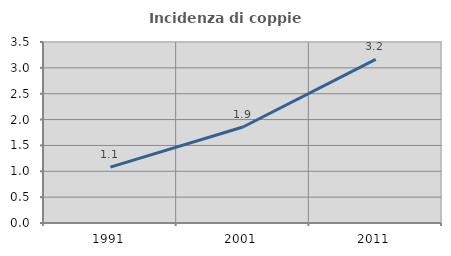
| Category | Incidenza di coppie miste |
|---|---|
| 1991.0 | 1.081 |
| 2001.0 | 1.856 |
| 2011.0 | 3.165 |